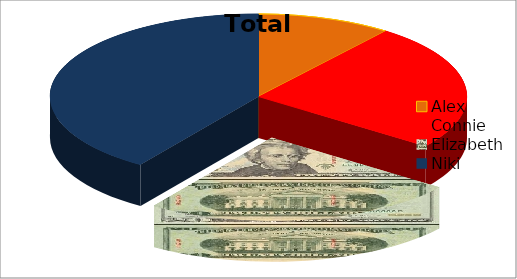
| Category | Total |
|---|---|
| Alex | 3500 |
| Connie | 8310 |
| Elizabeth | 8170 |
| Niki | 13560 |